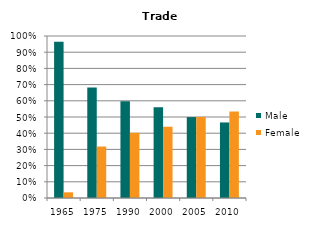
| Category | Male | Female |
|---|---|---|
| 1965.0 | 0.965 | 0.035 |
| 1975.0 | 0.682 | 0.318 |
| 1990.0 | 0.598 | 0.402 |
| 2000.0 | 0.56 | 0.44 |
| 2005.0 | 0.499 | 0.501 |
| 2010.0 | 0.466 | 0.534 |